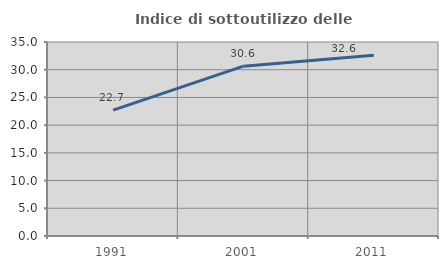
| Category | Indice di sottoutilizzo delle abitazioni  |
|---|---|
| 1991.0 | 22.699 |
| 2001.0 | 30.645 |
| 2011.0 | 32.597 |